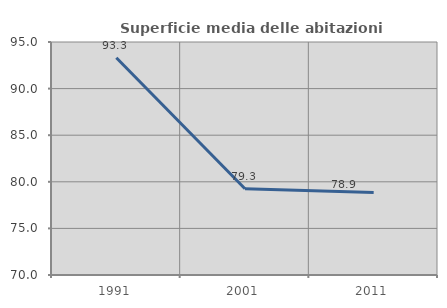
| Category | Superficie media delle abitazioni occupate |
|---|---|
| 1991.0 | 93.314 |
| 2001.0 | 79.258 |
| 2011.0 | 78.861 |